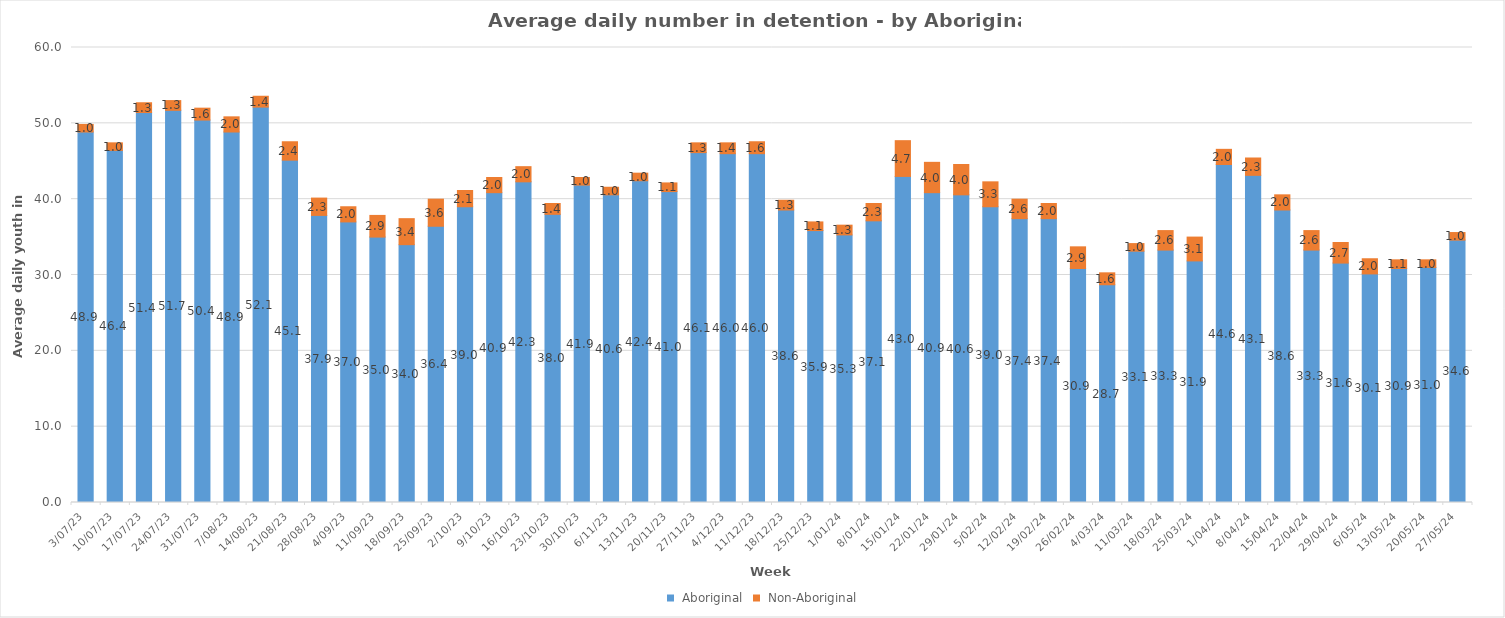
| Category |  Aboriginal |  Non-Aboriginal |
|---|---|---|
| 3/07/23 | 48.857 | 1 |
| 10/07/23 | 46.429 | 1 |
| 17/07/23 | 51.429 | 1.286 |
| 24/07/23 | 51.714 | 1.286 |
| 31/07/23 | 50.429 | 1.571 |
| 7/08/23 | 48.857 | 2 |
| 14/08/23 | 52.143 | 1.429 |
| 21/08/23 | 45.143 | 2.429 |
| 28/08/23 | 37.857 | 2.286 |
| 4/09/23 | 37 | 2 |
| 11/09/23 | 35 | 2.857 |
| 18/09/23 | 34 | 3.429 |
| 25/09/23 | 36.429 | 3.571 |
| 2/10/23 | 39 | 2.143 |
| 9/10/23 | 40.857 | 2 |
| 16/10/23 | 42.286 | 2 |
| 23/10/23 | 38 | 1.429 |
| 30/10/23 | 41.857 | 1 |
| 6/11/23 | 40.571 | 1 |
| 13/11/23 | 42.429 | 1 |
| 20/11/23 | 41 | 1.143 |
| 27/11/23 | 46.143 | 1.286 |
| 4/12/23 | 46 | 1.429 |
| 11/12/23 | 46 | 1.571 |
| 18/12/23 | 38.571 | 1.286 |
| 25/12/23 | 35.857 | 1.143 |
| 1/01/24 | 35.286 | 1.286 |
| 8/01/24 | 37.143 | 2.286 |
| 15/01/24 | 43 | 4.714 |
| 22/01/24 | 40.857 | 4 |
| 29/01/24 | 40.571 | 4 |
| 5/02/24 | 39 | 3.286 |
| 12/02/24 | 37.429 | 2.571 |
| 19/02/24 | 37.429 | 2 |
| 26/02/24 | 30.857 | 2.857 |
| 4/03/24 | 28.714 | 1.571 |
| 11/03/24 | 33.143 | 1 |
| 18/03/24 | 33.286 | 2.571 |
| 25/03/24 | 31.857 | 3.143 |
| 1/04/24 | 44.571 | 2 |
| 8/04/24 | 43.143 | 2.286 |
| 15/04/24 | 38.571 | 2 |
| 22/04/24 | 33.286 | 2.571 |
| 29/04/24 | 31.571 | 2.714 |
| 6/05/24 | 30.143 | 2 |
| 13/05/24 | 30.857 | 1.143 |
| 20/05/24 | 31 | 1 |
| 27/05/24 | 34.6 | 1 |